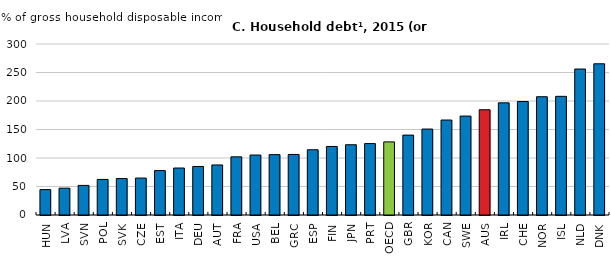
| Category | Household debt¹ |
|---|---|
| HUN | 44.587 |
| LVA | 47.075 |
| SVN | 51.909 |
| POL | 62.401 |
| SVK | 63.961 |
| CZE | 64.817 |
| EST | 77.948 |
| ITA | 82.427 |
| DEU | 85.133 |
| AUT | 87.791 |
| FRA | 102.054 |
| USA | 105.197 |
| BEL | 105.92 |
| GRC | 106.234 |
| ESP | 114.436 |
| FIN | 120.226 |
| JPN | 123.265 |
| PRT | 125.283 |
| OECD | 128.255 |
| GBR | 140.152 |
| KOR | 150.772 |
| CAN | 166.639 |
| SWE | 173.565 |
| AUS | 184.664 |
| IRL | 196.735 |
| CHE | 199.134 |
| NOR | 207.486 |
| ISL | 208.179 |
| NLD | 256.101 |
| DNK | 265.291 |